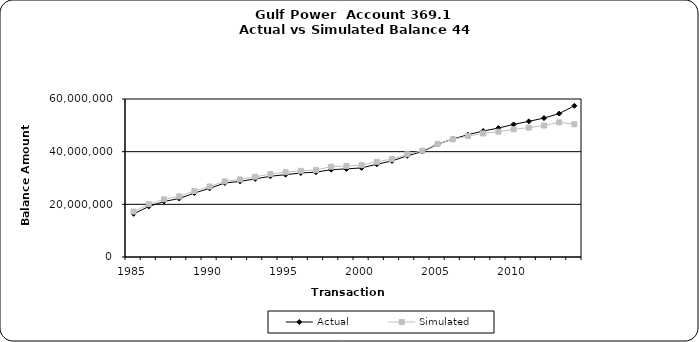
| Category | Actual | Simulated |
|---|---|---|
| 1985.0 | 16382238.12 | 17249225.509 |
| 1986.0 | 19187616.12 | 20048188.844 |
| 1987.0 | 21069907.32 | 21902089.645 |
| 1988.0 | 22209693.03 | 23030176.687 |
| 1989.0 | 24284458.03 | 25066117.28 |
| 1990.0 | 26064781.03 | 26767649.87 |
| 1991.0 | 28086075.03 | 28719661.443 |
| 1992.0 | 28714738.58 | 29447303.696 |
| 1993.0 | 29651323.05 | 30472122.299 |
| 1994.0 | 30658889.61 | 31502521.66 |
| 1995.0 | 31259081.52 | 32203445.429 |
| 1996.0 | 31898889.66 | 32723714.901 |
| 1997.0 | 32230915.66 | 33069551.439 |
| 1998.0 | 33145486.66 | 34292253.338 |
| 1999.0 | 33463711.66 | 34559513.558 |
| 2000.0 | 33846214.66 | 34884198.996 |
| 2001.0 | 35218963.73 | 36149396.6 |
| 2002.0 | 36481528.43 | 37194081.511 |
| 2003.0 | 38412477.23 | 39010802.564 |
| 2004.0 | 40035393.36 | 40375349.125 |
| 2005.0 | 42804558.36 | 42942044.149 |
| 2006.0 | 44800197.36 | 44677162.721 |
| 2007.0 | 46455537.36 | 45953807.768 |
| 2008.0 | 47847538.36 | 46923034.495 |
| 2009.0 | 48970585.29 | 47583846.018 |
| 2010.0 | 50352811.48 | 48466136.783 |
| 2011.0 | 51498379.04 | 49124156.468 |
| 2012.0 | 52762456.31 | 49923670.459 |
| 2013.0 | 54467608.85 | 51129406.267 |
| 2014.0 | 57418874.3 | 50412863.734 |